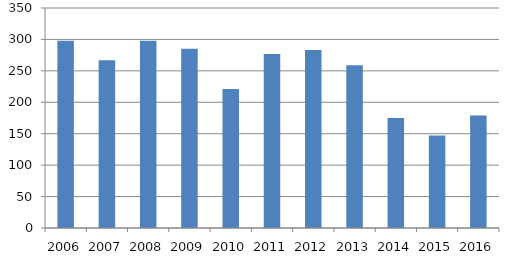
| Category | Series 0 |
|---|---|
| 2006.0 | 298 |
| 2007.0 | 267 |
| 2008.0 | 298 |
| 2009.0 | 285 |
| 2010.0 | 221 |
| 2011.0 | 277 |
| 2012.0 | 283 |
| 2013.0 | 259 |
| 2014.0 | 175 |
| 2015.0 | 147 |
| 2016.0 | 179 |